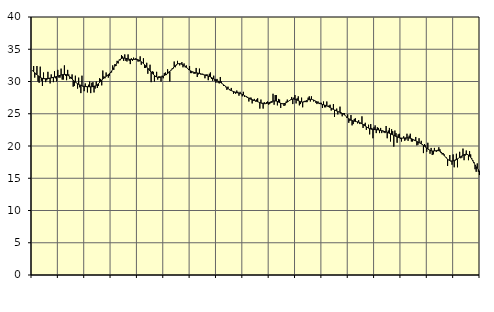
| Category | Piggar | Series 1 |
|---|---|---|
| nan | 31.7 | 31.64 |
| 87.0 | 32.4 | 31.52 |
| 87.0 | 30.6 | 31.37 |
| 87.0 | 31.1 | 31.2 |
| 87.0 | 32.4 | 31.05 |
| 87.0 | 30 | 30.9 |
| 87.0 | 29.8 | 30.77 |
| 87.0 | 32.3 | 30.65 |
| 87.0 | 30.1 | 30.55 |
| 87.0 | 29.3 | 30.48 |
| 87.0 | 31.4 | 30.44 |
| 87.0 | 30.5 | 30.42 |
| nan | 29.9 | 30.43 |
| 88.0 | 30.2 | 30.45 |
| 88.0 | 31.5 | 30.47 |
| 88.0 | 30.4 | 30.5 |
| 88.0 | 29.7 | 30.53 |
| 88.0 | 31.1 | 30.56 |
| 88.0 | 30.7 | 30.6 |
| 88.0 | 29.9 | 30.64 |
| 88.0 | 31.6 | 30.68 |
| 88.0 | 30.5 | 30.73 |
| 88.0 | 30 | 30.78 |
| 88.0 | 31.8 | 30.84 |
| nan | 30.6 | 30.89 |
| 89.0 | 30.6 | 30.95 |
| 89.0 | 32 | 31 |
| 89.0 | 30.3 | 31.05 |
| 89.0 | 30.3 | 31.09 |
| 89.0 | 32.5 | 31.1 |
| 89.0 | 30.9 | 31.09 |
| 89.0 | 30.2 | 31.05 |
| 89.0 | 31.8 | 30.97 |
| 89.0 | 31.1 | 30.86 |
| 89.0 | 30.4 | 30.72 |
| 89.0 | 30.7 | 30.56 |
| nan | 31.1 | 30.39 |
| 90.0 | 29.2 | 30.21 |
| 90.0 | 29.3 | 30.05 |
| 90.0 | 30.9 | 29.9 |
| 90.0 | 29.8 | 29.77 |
| 90.0 | 28.9 | 29.66 |
| 90.0 | 30.6 | 29.56 |
| 90.0 | 29.1 | 29.48 |
| 90.0 | 28.2 | 29.41 |
| 90.0 | 30.9 | 29.34 |
| 90.0 | 29.2 | 29.29 |
| 90.0 | 28.5 | 29.25 |
| nan | 29.7 | 29.22 |
| 91.0 | 29.3 | 29.2 |
| 91.0 | 28.3 | 29.2 |
| 91.0 | 29.5 | 29.19 |
| 91.0 | 30 | 29.18 |
| 91.0 | 28.2 | 29.18 |
| 91.0 | 29.8 | 29.19 |
| 91.0 | 29.9 | 29.21 |
| 91.0 | 28.3 | 29.25 |
| 91.0 | 28.9 | 29.31 |
| 91.0 | 30 | 29.4 |
| 91.0 | 29 | 29.52 |
| nan | 29.3 | 29.67 |
| 92.0 | 30.5 | 29.84 |
| 92.0 | 30.4 | 30.03 |
| 92.0 | 29.4 | 30.21 |
| 92.0 | 31.7 | 30.38 |
| 92.0 | 30.8 | 30.53 |
| 92.0 | 30.5 | 30.66 |
| 92.0 | 31.4 | 30.79 |
| 92.0 | 31 | 30.92 |
| 92.0 | 30.6 | 31.06 |
| 92.0 | 30.9 | 31.23 |
| 92.0 | 31.3 | 31.41 |
| nan | 31.4 | 31.62 |
| 93.0 | 32.5 | 31.86 |
| 93.0 | 31.8 | 32.11 |
| 93.0 | 32.7 | 32.38 |
| 93.0 | 32.4 | 32.64 |
| 93.0 | 33.2 | 32.89 |
| 93.0 | 32.8 | 33.12 |
| 93.0 | 33.4 | 33.31 |
| 93.0 | 33.3 | 33.45 |
| 93.0 | 34.1 | 33.56 |
| 93.0 | 33.9 | 33.62 |
| 93.0 | 33.2 | 33.64 |
| nan | 34.2 | 33.62 |
| 94.0 | 33.2 | 33.58 |
| 94.0 | 33.1 | 33.53 |
| 94.0 | 34.2 | 33.48 |
| 94.0 | 33.2 | 33.44 |
| 94.0 | 32.7 | 33.42 |
| 94.0 | 33.6 | 33.41 |
| 94.0 | 33.2 | 33.41 |
| 94.0 | 33.7 | 33.43 |
| 94.0 | 33.5 | 33.43 |
| 94.0 | 33.6 | 33.43 |
| 94.0 | 33.5 | 33.42 |
| nan | 33.1 | 33.37 |
| 95.0 | 33.1 | 33.3 |
| 95.0 | 33.9 | 33.2 |
| 95.0 | 32.6 | 33.07 |
| 95.0 | 32.9 | 32.93 |
| 95.0 | 33.6 | 32.78 |
| 95.0 | 32.1 | 32.61 |
| 95.0 | 32.1 | 32.43 |
| 95.0 | 32.9 | 32.24 |
| 95.0 | 31.2 | 32.04 |
| 95.0 | 32 | 31.84 |
| 95.0 | 32.6 | 31.64 |
| nan | 29.9 | 31.45 |
| 96.0 | 31.6 | 31.27 |
| 96.0 | 31.5 | 31.1 |
| 96.0 | 30 | 30.95 |
| 96.0 | 30.7 | 30.81 |
| 96.0 | 31.5 | 30.71 |
| 96.0 | 30.3 | 30.64 |
| 96.0 | 30.8 | 30.62 |
| 96.0 | 30.8 | 30.64 |
| 96.0 | 30 | 30.69 |
| 96.0 | 30.9 | 30.76 |
| 96.0 | 30.5 | 30.83 |
| nan | 31.3 | 30.92 |
| 97.0 | 31.4 | 31.02 |
| 97.0 | 31 | 31.12 |
| 97.0 | 31.9 | 31.24 |
| 97.0 | 31.5 | 31.39 |
| 97.0 | 30 | 31.55 |
| 97.0 | 31.8 | 31.72 |
| 97.0 | 32 | 31.9 |
| 97.0 | 32 | 32.09 |
| 97.0 | 33.1 | 32.28 |
| 97.0 | 32.2 | 32.46 |
| 97.0 | 32.5 | 32.61 |
| nan | 33.2 | 32.71 |
| 98.0 | 32.8 | 32.77 |
| 98.0 | 32.5 | 32.78 |
| 98.0 | 32.7 | 32.74 |
| 98.0 | 33 | 32.67 |
| 98.0 | 32.2 | 32.58 |
| 98.0 | 32.8 | 32.47 |
| 98.0 | 32.2 | 32.34 |
| 98.0 | 32.5 | 32.2 |
| 98.0 | 32.1 | 32.06 |
| 98.0 | 31.8 | 31.91 |
| 98.0 | 32.4 | 31.77 |
| nan | 31.3 | 31.65 |
| 99.0 | 31.3 | 31.55 |
| 99.0 | 31.5 | 31.47 |
| 99.0 | 31.2 | 31.42 |
| 99.0 | 31.2 | 31.38 |
| 99.0 | 32.1 | 31.35 |
| 99.0 | 30.7 | 31.33 |
| 99.0 | 31.1 | 31.29 |
| 99.0 | 32 | 31.25 |
| 99.0 | 31.1 | 31.21 |
| 99.0 | 31.1 | 31.16 |
| 99.0 | 31.2 | 31.1 |
| nan | 31 | 31.04 |
| 0.0 | 30.5 | 30.99 |
| 0.0 | 31.1 | 30.94 |
| 0.0 | 31.1 | 30.9 |
| 0.0 | 30.2 | 30.84 |
| 0.0 | 31.2 | 30.78 |
| 0.0 | 31.4 | 30.7 |
| 0.0 | 30.4 | 30.61 |
| 0.0 | 30.1 | 30.52 |
| 0.0 | 30.9 | 30.42 |
| 0.0 | 30.1 | 30.33 |
| 0.0 | 29.8 | 30.24 |
| nan | 30.4 | 30.15 |
| 1.0 | 29.8 | 30.06 |
| 1.0 | 29.7 | 29.97 |
| 1.0 | 30.7 | 29.87 |
| 1.0 | 30 | 29.75 |
| 1.0 | 29.6 | 29.63 |
| 1.0 | 29.3 | 29.49 |
| 1.0 | 29.3 | 29.35 |
| 1.0 | 29.1 | 29.2 |
| 1.0 | 28.7 | 29.06 |
| 1.0 | 29.2 | 28.92 |
| 1.0 | 28.8 | 28.79 |
| nan | 28.6 | 28.69 |
| 2.0 | 29 | 28.6 |
| 2.0 | 28.5 | 28.52 |
| 2.0 | 28.1 | 28.45 |
| 2.0 | 28.3 | 28.39 |
| 2.0 | 28.1 | 28.33 |
| 2.0 | 28.6 | 28.28 |
| 2.0 | 28.4 | 28.23 |
| 2.0 | 27.8 | 28.18 |
| 2.0 | 28.4 | 28.13 |
| 2.0 | 28.1 | 28.08 |
| 2.0 | 27.7 | 28 |
| nan | 28.4 | 27.92 |
| 3.0 | 27.6 | 27.82 |
| 3.0 | 27.7 | 27.71 |
| 3.0 | 27.7 | 27.59 |
| 3.0 | 27.6 | 27.49 |
| 3.0 | 26.9 | 27.4 |
| 3.0 | 27.5 | 27.31 |
| 3.0 | 27.5 | 27.24 |
| 3.0 | 26.6 | 27.18 |
| 3.0 | 27 | 27.13 |
| 3.0 | 27.3 | 27.07 |
| 3.0 | 26.9 | 27.01 |
| nan | 27.2 | 26.94 |
| 4.0 | 27.4 | 26.87 |
| 4.0 | 26.8 | 26.8 |
| 4.0 | 25.8 | 26.73 |
| 4.0 | 27.2 | 26.67 |
| 4.0 | 26.7 | 26.62 |
| 4.0 | 25.8 | 26.58 |
| 4.0 | 26.8 | 26.56 |
| 4.0 | 26.6 | 26.56 |
| 4.0 | 26.8 | 26.59 |
| 4.0 | 26.9 | 26.64 |
| 4.0 | 26.4 | 26.7 |
| nan | 26.5 | 26.77 |
| 5.0 | 26.7 | 26.84 |
| 5.0 | 26.7 | 26.9 |
| 5.0 | 28.1 | 26.96 |
| 5.0 | 26.4 | 26.99 |
| 5.0 | 27.9 | 26.99 |
| 5.0 | 27.9 | 26.96 |
| 5.0 | 26.3 | 26.9 |
| 5.0 | 27.3 | 26.81 |
| 5.0 | 27.2 | 26.72 |
| 5.0 | 25.9 | 26.63 |
| 5.0 | 26.6 | 26.57 |
| nan | 26.5 | 26.55 |
| 6.0 | 26.2 | 26.56 |
| 6.0 | 26.3 | 26.62 |
| 6.0 | 26.9 | 26.7 |
| 6.0 | 27.2 | 26.81 |
| 6.0 | 26.9 | 26.93 |
| 6.0 | 27.1 | 27.05 |
| 6.0 | 27.2 | 27.15 |
| 6.0 | 27.6 | 27.23 |
| 6.0 | 26.5 | 27.27 |
| 6.0 | 27.5 | 27.28 |
| 6.0 | 27.9 | 27.25 |
| nan | 26.6 | 27.2 |
| 7.0 | 27.4 | 27.12 |
| 7.0 | 27.7 | 27.03 |
| 7.0 | 26.3 | 26.95 |
| 7.0 | 26.5 | 26.87 |
| 7.0 | 27.5 | 26.83 |
| 7.0 | 26 | 26.81 |
| 7.0 | 26.9 | 26.83 |
| 7.0 | 27 | 26.89 |
| 7.0 | 26.8 | 26.97 |
| 7.0 | 26.8 | 27.07 |
| 7.0 | 27.5 | 27.15 |
| nan | 27.7 | 27.21 |
| 8.0 | 26.9 | 27.24 |
| 8.0 | 27.7 | 27.24 |
| 8.0 | 27.2 | 27.19 |
| 8.0 | 26.9 | 27.13 |
| 8.0 | 27 | 27.04 |
| 8.0 | 26.7 | 26.93 |
| 8.0 | 26.5 | 26.83 |
| 8.0 | 26.9 | 26.73 |
| 8.0 | 26.5 | 26.64 |
| 8.0 | 26.7 | 26.57 |
| 8.0 | 26.7 | 26.5 |
| nan | 25.9 | 26.44 |
| 9.0 | 26.9 | 26.39 |
| 9.0 | 26 | 26.34 |
| 9.0 | 26 | 26.29 |
| 9.0 | 26.9 | 26.23 |
| 9.0 | 26.1 | 26.15 |
| 9.0 | 26.3 | 26.06 |
| 9.0 | 26.4 | 25.97 |
| 9.0 | 25.5 | 25.87 |
| 9.0 | 25.7 | 25.77 |
| 9.0 | 26.5 | 25.68 |
| 9.0 | 24.5 | 25.58 |
| nan | 25.6 | 25.5 |
| 10.0 | 25.8 | 25.42 |
| 10.0 | 24.9 | 25.35 |
| 10.0 | 25.3 | 25.29 |
| 10.0 | 26.1 | 25.23 |
| 10.0 | 25 | 25.15 |
| 10.0 | 24.6 | 25.06 |
| 10.0 | 25.1 | 24.96 |
| 10.0 | 25.1 | 24.82 |
| 10.0 | 24.7 | 24.68 |
| 10.0 | 24.4 | 24.52 |
| 10.0 | 24.9 | 24.37 |
| nan | 23.6 | 24.24 |
| 11.0 | 23.9 | 24.12 |
| 11.0 | 24.8 | 24.02 |
| 11.0 | 23.2 | 23.95 |
| 11.0 | 23.4 | 23.89 |
| 11.0 | 24.2 | 23.85 |
| 11.0 | 24.3 | 23.81 |
| 11.0 | 23.8 | 23.78 |
| 11.0 | 23.5 | 23.74 |
| 11.0 | 24 | 23.69 |
| 11.0 | 23.4 | 23.62 |
| 11.0 | 23.6 | 23.53 |
| nan | 24.6 | 23.43 |
| 12.0 | 22.8 | 23.32 |
| 12.0 | 23.4 | 23.2 |
| 12.0 | 23.6 | 23.09 |
| 12.0 | 22.5 | 22.97 |
| 12.0 | 22.8 | 22.87 |
| 12.0 | 23.3 | 22.77 |
| 12.0 | 21.8 | 22.69 |
| 12.0 | 23.4 | 22.63 |
| 12.0 | 22.8 | 22.59 |
| 12.0 | 21.2 | 22.57 |
| 12.0 | 22.9 | 22.55 |
| nan | 23.2 | 22.54 |
| 13.0 | 22 | 22.53 |
| 13.0 | 22.9 | 22.51 |
| 13.0 | 22.8 | 22.49 |
| 13.0 | 22 | 22.46 |
| 13.0 | 22.8 | 22.41 |
| 13.0 | 22 | 22.37 |
| 13.0 | 22.4 | 22.32 |
| 13.0 | 22.1 | 22.27 |
| 13.0 | 22 | 22.22 |
| 13.0 | 23.1 | 22.17 |
| 13.0 | 21.2 | 22.11 |
| nan | 22.4 | 22.05 |
| 14.0 | 22.8 | 21.97 |
| 14.0 | 20.7 | 21.9 |
| 14.0 | 22.6 | 21.81 |
| 14.0 | 22.3 | 21.73 |
| 14.0 | 19.9 | 21.65 |
| 14.0 | 22.4 | 21.56 |
| 14.0 | 22 | 21.49 |
| 14.0 | 20.5 | 21.41 |
| 14.0 | 21.8 | 21.35 |
| 14.0 | 21.9 | 21.29 |
| 14.0 | 21.1 | 21.25 |
| nan | 20.7 | 21.23 |
| 15.0 | 21.2 | 21.23 |
| 15.0 | 21.5 | 21.23 |
| 15.0 | 20.8 | 21.24 |
| 15.0 | 21 | 21.26 |
| 15.0 | 21.9 | 21.27 |
| 15.0 | 20.8 | 21.27 |
| 15.0 | 21.6 | 21.24 |
| 15.0 | 21.9 | 21.19 |
| 15.0 | 20.7 | 21.13 |
| 15.0 | 20.7 | 21.06 |
| 15.0 | 20.9 | 20.97 |
| nan | 20.8 | 20.89 |
| 16.0 | 21.4 | 20.8 |
| 16.0 | 20.1 | 20.71 |
| 16.0 | 20.2 | 20.62 |
| 16.0 | 21.2 | 20.53 |
| 16.0 | 20.5 | 20.44 |
| 16.0 | 20.8 | 20.34 |
| 16.0 | 20.3 | 20.22 |
| 16.0 | 18.9 | 20.1 |
| 16.0 | 20.3 | 19.96 |
| 16.0 | 20.1 | 19.82 |
| 16.0 | 19.1 | 19.68 |
| nan | 20.5 | 19.54 |
| 17.0 | 19.4 | 19.42 |
| 17.0 | 18.8 | 19.33 |
| 17.0 | 19.7 | 19.27 |
| 17.0 | 18.6 | 19.23 |
| 17.0 | 18.7 | 19.23 |
| 17.0 | 19.7 | 19.24 |
| 17.0 | 19.2 | 19.26 |
| 17.0 | 19.1 | 19.29 |
| 17.0 | 19.4 | 19.3 |
| 17.0 | 19.8 | 19.27 |
| 17.0 | 19.5 | 19.2 |
| nan | 18.9 | 19.08 |
| 18.0 | 18.7 | 18.91 |
| 18.0 | 18.9 | 18.71 |
| 18.0 | 18.7 | 18.5 |
| 18.0 | 18.3 | 18.3 |
| 18.0 | 18.2 | 18.11 |
| 18.0 | 16.9 | 17.96 |
| 18.0 | 17.8 | 17.83 |
| 18.0 | 18.6 | 17.74 |
| 18.0 | 17.6 | 17.69 |
| 18.0 | 17.1 | 17.67 |
| 18.0 | 18.7 | 17.68 |
| nan | 16.7 | 17.73 |
| 19.0 | 17.9 | 17.79 |
| 19.0 | 18.8 | 17.89 |
| 19.0 | 16.7 | 18 |
| 19.0 | 18.1 | 18.11 |
| 19.0 | 19.1 | 18.23 |
| 19.0 | 18.1 | 18.35 |
| 19.0 | 18.2 | 18.46 |
| 19.0 | 19.6 | 18.56 |
| 19.0 | 17.8 | 18.65 |
| 19.0 | 18.5 | 18.71 |
| 19.0 | 19.3 | 18.72 |
| nan | 18.6 | 18.69 |
| 20.0 | 17.8 | 18.6 |
| 20.0 | 19.2 | 18.45 |
| 20.0 | 18.7 | 18.24 |
| 20.0 | 18.1 | 17.98 |
| 20.0 | 17.8 | 17.69 |
| 20.0 | 17.5 | 17.37 |
| 20.0 | 16.4 | 17.06 |
| 20.0 | 16 | 16.77 |
| 20.0 | 17.3 | 16.51 |
| 20.0 | 16 | 16.31 |
| 20.0 | 15.5 | 16.16 |